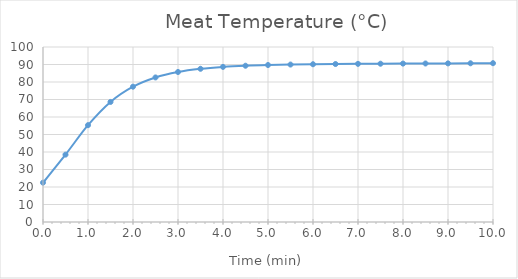
| Category | Series 0 |
|---|---|
| 0.0 | 22.483 |
| 0.5 | 38.49 |
| 1.0 | 55.326 |
| 1.5 | 68.6 |
| 2.0 | 77.325 |
| 2.5 | 82.603 |
| 3.0 | 85.715 |
| 3.5 | 87.548 |
| 4.0 | 88.638 |
| 4.5 | 89.297 |
| 5.0 | 89.706 |
| 5.5 | 89.968 |
| 6.0 | 90.145 |
| 6.5 | 90.272 |
| 7.0 | 90.368 |
| 7.5 | 90.448 |
| 8.0 | 90.516 |
| 8.5 | 90.579 |
| 9.0 | 90.637 |
| 9.5 | 90.693 |
| 10.0 | 90.748 |